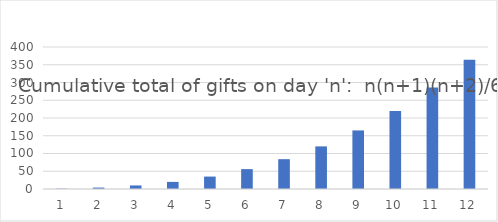
| Category | n(n+1)(n+2)/6 |
|---|---|
| 1.0 | 1 |
| 2.0 | 4 |
| 3.0 | 10 |
| 4.0 | 20 |
| 5.0 | 35 |
| 6.0 | 56 |
| 7.0 | 84 |
| 8.0 | 120 |
| 9.0 | 165 |
| 10.0 | 220 |
| 11.0 | 286 |
| 12.0 | 364 |